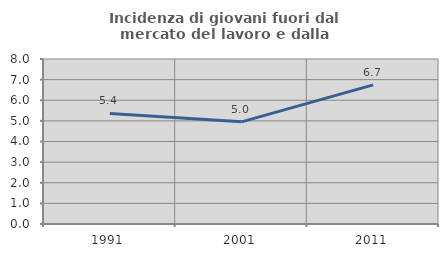
| Category | Incidenza di giovani fuori dal mercato del lavoro e dalla formazione  |
|---|---|
| 1991.0 | 5.362 |
| 2001.0 | 4.954 |
| 2011.0 | 6.746 |